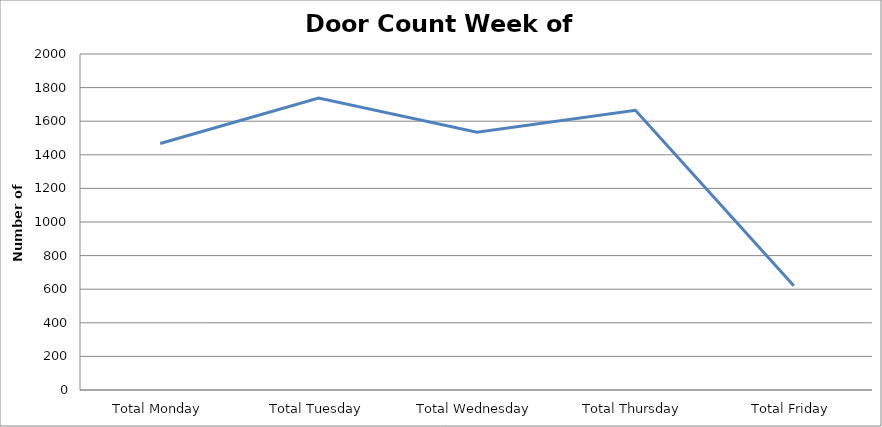
| Category | Series 0 |
|---|---|
| Total Monday | 1467.5 |
| Total Tuesday | 1737.5 |
| Total Wednesday | 1534.5 |
| Total Thursday | 1665 |
| Total Friday | 620 |